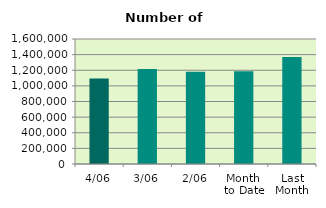
| Category | Series 0 |
|---|---|
| 4/06 | 1094544 |
| 3/06 | 1217594 |
| 2/06 | 1180064 |
| Month 
to Date | 1186999 |
| Last
Month | 1368600.286 |